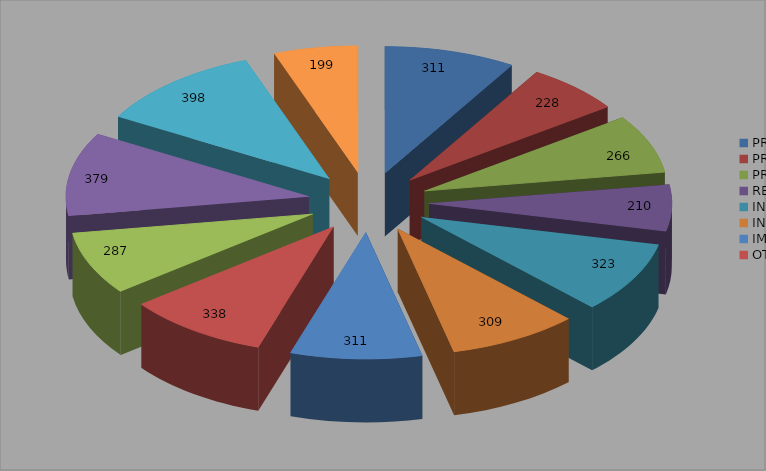
| Category | Series 0 |
|---|---|
| PROCEDENTE  | 311 |
| PROCEDENTE PARCIAL POR CONFIDENCIALIDAD  | 228 |
| PROCEDENTE PARCIAL POR INEXISTENCIA | 266 |
| RESERVADA | 210 |
| INEXISTENCIA | 323 |
| INCOMPETENCIA | 309 |
| IMPROCEDENTE NO RESPONDIO PREVENCION | 311 |
| OTRAS | 338 |